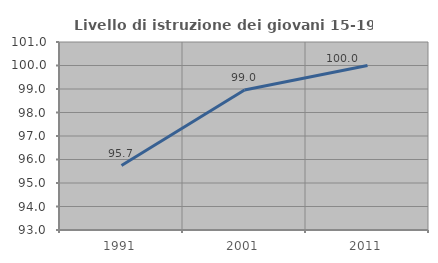
| Category | Livello di istruzione dei giovani 15-19 anni |
|---|---|
| 1991.0 | 95.745 |
| 2001.0 | 98.958 |
| 2011.0 | 100 |